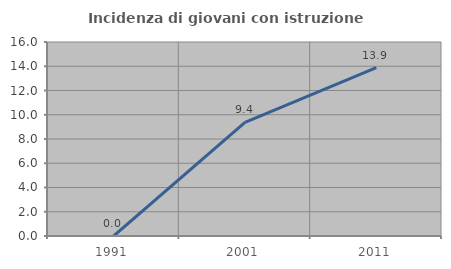
| Category | Incidenza di giovani con istruzione universitaria |
|---|---|
| 1991.0 | 0 |
| 2001.0 | 9.375 |
| 2011.0 | 13.889 |